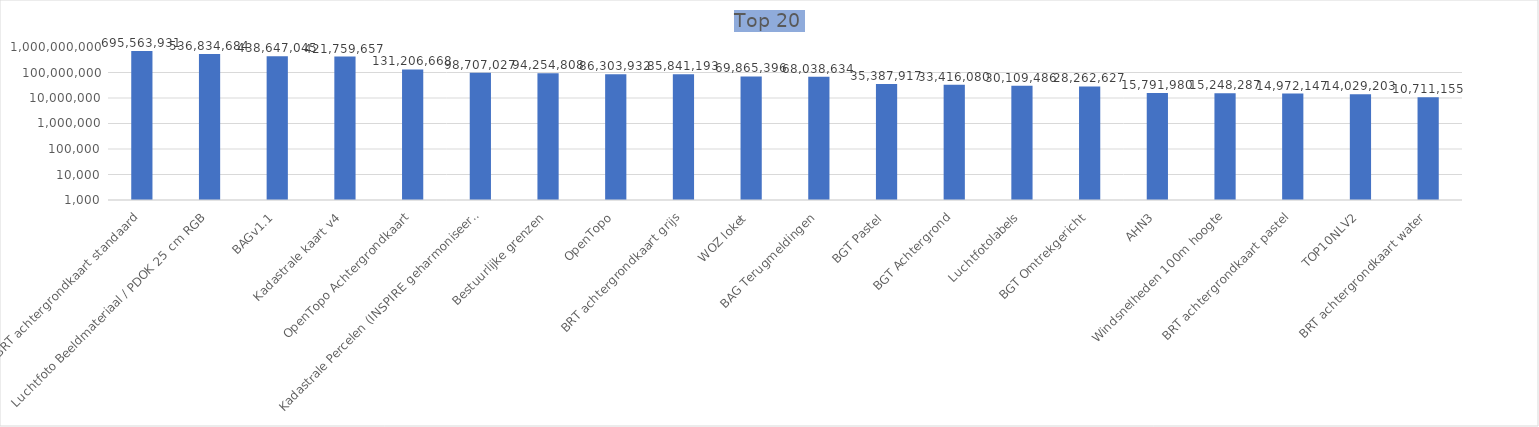
| Category | Q 3 |
|---|---|
| BRT achtergrondkaart standaard | 695563931 |
| Luchtfoto Beeldmateriaal / PDOK 25 cm RGB | 536834684 |
| BAGv1.1 | 438647045 |
| Kadastrale kaart v4 | 421759657 |
| OpenTopo Achtergrondkaart | 131206668 |
| Kadastrale Percelen (INSPIRE geharmoniseerd) | 98707027 |
| Bestuurlijke grenzen | 94254808 |
| OpenTopo | 86303932 |
| BRT achtergrondkaart grijs | 85841193 |
| WOZ loket | 69865396 |
| BAG Terugmeldingen | 68038634 |
| BGT Pastel | 35387917 |
| BGT Achtergrond | 33416080 |
| Luchtfotolabels | 30109486 |
| BGT Omtrekgericht | 28262627 |
| AHN3 | 15791980 |
| Windsnelheden 100m hoogte | 15248287 |
| BRT achtergrondkaart pastel | 14972147 |
| TOP10NLV2 | 14029203 |
| BRT achtergrondkaart water | 10711155 |